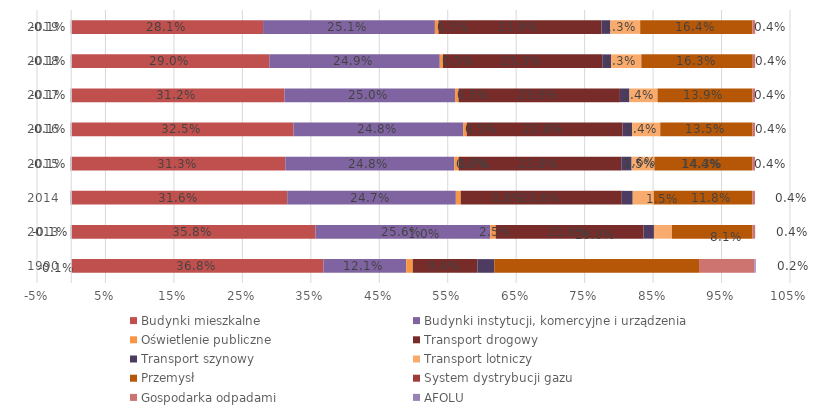
| Category | Budynki mieszkalne | Budynki instytucji, komercyjne i urządzenia | Oświetlenie publiczne | Transport drogowy | Transport szynowy | Transport lotniczy | Przemysł | System dystrybucji gazu | Gospodarka odpadami | AFOLU |
|---|---|---|---|---|---|---|---|---|---|---|
| 1990.0 | 0.368 | 0.121 | 0.01 | 0.094 | 0.025 | 0 | 0.299 | 0 | 0.081 | 0.002 |
| 2013.0 | 0.358 | 0.256 | 0.008 | 0.216 | 0.015 | 0.026 | 0.118 | 0 | 0.004 | -0.001 |
| 2014.0 | 0.316 | 0.247 | 0.007 | 0.236 | 0.016 | 0.031 | 0.144 | 0 | 0.004 | -0.001 |
| 2015.0 | 0.313 | 0.248 | 0.006 | 0.238 | 0.015 | 0.033 | 0.143 | 0 | 0.004 | -0.001 |
| 2016.0 | 0.325 | 0.248 | 0.005 | 0.228 | 0.014 | 0.041 | 0.135 | 0 | 0.004 | -0.001 |
| 2017.0 | 0.312 | 0.25 | 0.005 | 0.236 | 0.014 | 0.041 | 0.139 | 0 | 0.004 | -0.001 |
| 2018.0 | 0.29 | 0.249 | 0.005 | 0.233 | 0.013 | 0.044 | 0.163 | 0 | 0.004 | -0.001 |
| 2019.0 | 0.281 | 0.251 | 0.005 | 0.239 | 0.013 | 0.044 | 0.164 | 0 | 0.004 | -0.001 |